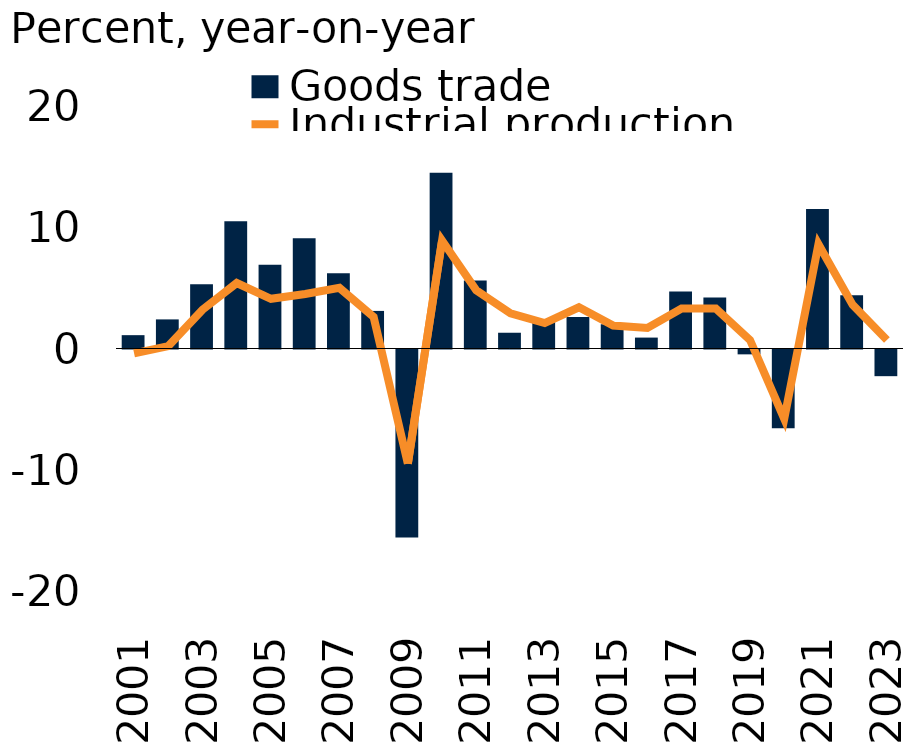
| Category | Goods trade |
|---|---|
| 2001.0 | 1.1 |
| 2002.0 | 2.4 |
| 2003.0 | 5.3 |
| 2004.0 | 10.5 |
| 2005.0 | 6.9 |
| 2006.0 | 9.1 |
| 2007.0 | 6.2 |
| 2008.0 | 3.1 |
| 2009.0 | -15.5 |
| 2010.0 | 14.5 |
| 2011.0 | 5.6 |
| 2012.0 | 1.3 |
| 2013.0 | 2.2 |
| 2014.0 | 2.6 |
| 2015.0 | 2 |
| 2016.0 | 0.9 |
| 2017.0 | 4.7 |
| 2018.0 | 4.2 |
| 2019.0 | -0.4 |
| 2020.0 | -6.5 |
| 2021.0 | 11.5 |
| 2022.0 | 4.4 |
| 2023.0 | -2.2 |